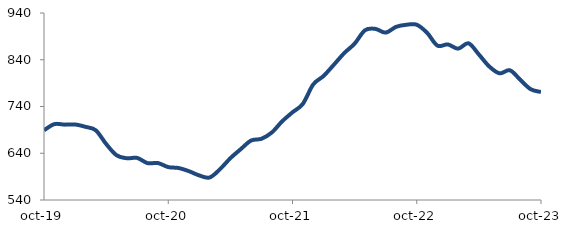
| Category | Series 0 |
|---|---|
| 2019-10-01 | 689.137 |
| 2019-11-01 | 702.277 |
| 2019-12-01 | 701.214 |
| 2020-01-01 | 701.517 |
| 2020-02-01 | 696.552 |
| 2020-03-01 | 689.099 |
| 2020-04-01 | 659.896 |
| 2020-05-01 | 635.894 |
| 2020-06-01 | 629.29 |
| 2020-07-01 | 629.994 |
| 2020-08-01 | 618.866 |
| 2020-09-01 | 619.022 |
| 2020-10-01 | 610.428 |
| 2020-11-01 | 608.402 |
| 2020-12-01 | 601.605 |
| 2021-01-01 | 592.504 |
| 2021-02-01 | 588.185 |
| 2021-03-01 | 605.989 |
| 2021-04-01 | 629.446 |
| 2021-05-01 | 648.73 |
| 2021-06-01 | 667.177 |
| 2021-07-01 | 670.996 |
| 2021-08-01 | 684.389 |
| 2021-09-01 | 708.308 |
| 2021-10-01 | 727.608 |
| 2021-11-01 | 745.65 |
| 2021-12-01 | 787.184 |
| 2022-01-01 | 805.308 |
| 2022-02-01 | 829.502 |
| 2022-03-01 | 854.336 |
| 2022-04-01 | 874.453 |
| 2022-05-01 | 903.049 |
| 2022-06-01 | 906.022 |
| 2022-07-01 | 898.071 |
| 2022-08-01 | 910.353 |
| 2022-09-01 | 914.859 |
| 2022-10-01 | 914.857 |
| 2022-11-01 | 897.607 |
| 2022-12-01 | 870.196 |
| 2023-01-01 | 872.784 |
| 2023-02-01 | 863.736 |
| 2023-03-01 | 875.118 |
| 2023-04-01 | 851.276 |
| 2023-05-01 | 825.667 |
| 2023-06-01 | 810.924 |
| 2023-07-01 | 817.469 |
| 2023-08-01 | 797.001 |
| 2023-09-01 | 777.024 |
| 2023-10-01 | 770.975 |